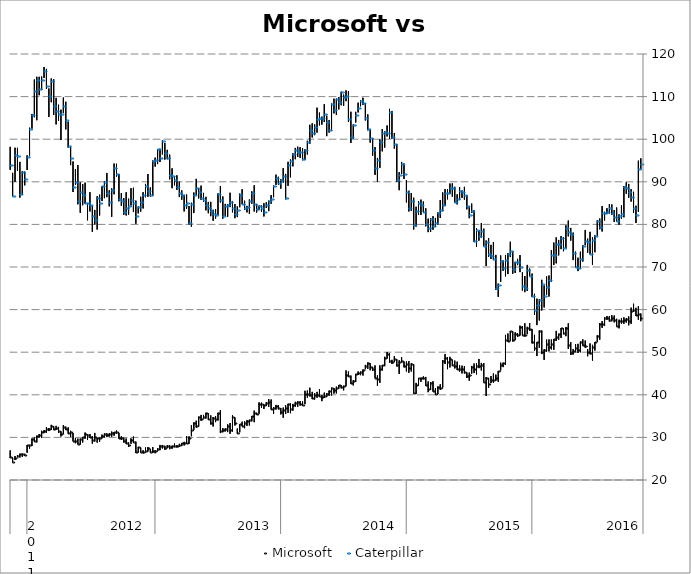
| Category | Series 0 | Series 1 | Microsoft |
|---|---|---|---|
| 0 | 59.08 | 57.28 | 58.12 |
| 1/1/00 | 60.78 | 57.63 | 59.02 |
| 1/2/00 | 60.42 | 58.52 | 58.71 |
| 1/3/00 | 61.37 | 59.58 | 59.87 |
| 1/4/00 | 60.45 | 56.66 | 59.66 |
| 1/5/00 | 58.39 | 56.32 | 57.42 |
| 1/6/00 | 57.98 | 56.97 | 57.8 |
| 1/7/00 | 58.17 | 56.68 | 57.6 |
| 1/8/00 | 58 | 56.75 | 57.43 |
| 1/9/00 | 57.63 | 55.61 | 57.25 |
| 1/10/00 | 57.84 | 56.21 | 56.21 |
| 1/11/00 | 58.6 | 57.01 | 57.67 |
| 1/12/00 | 58.7 | 57.26 | 58.03 |
| 1/13/00 | 58.5 | 57.2 | 57.62 |
| 1/14/00 | 58.5 | 57.62 | 57.94 |
| 1/15/00 | 58.21 | 56.14 | 57.96 |
| 1/16/00 | 57.29 | 55.72 | 56.68 |
| 1/17/00 | 56.84 | 52.93 | 56.57 |
| 1/18/00 | 54 | 52.47 | 53.7 |
| 1/19/00 | 52.36 | 50.39 | 52.3 |
| 1/20/00 | 51.72 | 48.04 | 51.16 |
| 1/21/00 | 52.06 | 49.52 | 49.83 |
| 1/22/00 | 50.72 | 49.06 | 50.13 |
| 1/23/00 | 52.73 | 51.04 | 51.48 |
| 1/24/00 | 53 | 51.6 | 51.79 |
| 1/25/00 | 52.49 | 49.98 | 52.32 |
| 1/26/00 | 51.96 | 49.82 | 50.62 |
| 1/27/00 | 51.9 | 50 | 51.08 |
| 1/28/00 | 50.75 | 49.46 | 50.39 |
| 1/29/00 | 52.35 | 49.35 | 49.87 |
| 1/30/00 | 56.77 | 50.77 | 51.78 |
| 1/31/00 | 55.92 | 53.76 | 55.65 |
| 2/1/00 | 55.66 | 54.21 | 54.42 |
| 2/2/00 | 55.64 | 53.33 | 55.57 |
| 2/3/00 | 54.33 | 52.93 | 54.21 |
| 2/4/00 | 55 | 52.63 | 53.49 |
| 2/5/00 | 53.07 | 50.58 | 53.07 |
| 2/6/00 | 52.97 | 50.66 | 52.03 |
| 2/7/00 | 53 | 50.2 | 51.3 |
| 2/8/00 | 52.95 | 50.13 | 51.82 |
| 2/9/00 | 50.68 | 48.19 | 50.5 |
| 2/10/00 | 55.09 | 49.56 | 50.16 |
| 2/11/00 | 55.09 | 51.02 | 55.09 |
| 2/12/00 | 52.33 | 49.1 | 52.29 |
| 2/13/00 | 54.07 | 50.34 | 50.99 |
| 2/14/00 | 55.39 | 52.07 | 52.33 |
| 2/15/00 | 56.85 | 54.98 | 55.48 |
| 2/16/00 | 55.96 | 54.23 | 55.67 |
| 2/17/00 | 56.79 | 53.68 | 54.13 |
| 2/18/00 | 56.1 | 54.01 | 54.06 |
| 2/19/00 | 56.23 | 53.93 | 55.91 |
| 2/20/00 | 54.46 | 53.58 | 53.93 |
| 2/21/00 | 54.66 | 52.85 | 54.19 |
| 2/22/00 | 54.87 | 52.53 | 52.84 |
| 2/23/00 | 54.98 | 52.62 | 54.92 |
| 2/24/00 | 54.37 | 52.5 | 52.64 |
| 2/25/00 | 54.07 | 47.02 | 52.87 |
| 2/26/00 | 47.54 | 46.5 | 47.51 |
| 2/27/00 | 47.54 | 45.7 | 47.11 |
| 2/28/00 | 45.57 | 43.05 | 45.57 |
| 2/28/00 | 44.73 | 43.27 | 43.94 |
| 3/1/00 | 45 | 42.86 | 43.48 |
| 3/2/00 | 44.4 | 42.75 | 43.48 |
| 3/3/00 | 43.98 | 41.66 | 42.61 |
| 3/4/00 | 44.15 | 39.72 | 43.93 |
| 3/5/00 | 47.45 | 43.07 | 43.07 |
| 3/6/00 | 47.49 | 45.71 | 47 |
| 3/7/00 | 48.41 | 46.26 | 46.74 |
| 3/8/00 | 47.4 | 44.79 | 46.7 |
| 3/9/00 | 47.33 | 45.1 | 45.94 |
| 3/10/00 | 46.78 | 44.95 | 46.62 |
| 3/11/00 | 45.22 | 43.32 | 44.61 |
| 3/12/00 | 45.23 | 43.94 | 44.4 |
| 3/13/00 | 46.72 | 45.03 | 45.26 |
| 3/14/00 | 46.83 | 45.02 | 46.1 |
| 3/15/00 | 46.92 | 45.46 | 45.97 |
| 3/16/00 | 47.77 | 45.84 | 46.14 |
| 3/17/00 | 48.02 | 46.19 | 46.86 |
| 3/18/00 | 48.22 | 46.82 | 46.9 |
| 3/19/00 | 48.91 | 46.42 | 48.3 |
| 3/20/00 | 48.87 | 46.02 | 47.75 |
| 3/21/00 | 49.54 | 47.22 | 48.66 |
| 3/22/00 | 48.14 | 41.68 | 47.87 |
| 3/23/00 | 42.46 | 41.16 | 41.62 |
| 3/24/00 | 41.95 | 40.18 | 41.72 |
| 3/25/00 | 41.54 | 40.12 | 40.29 |
| 3/26/00 | 43.17 | 40.83 | 40.97 |
| 3/27/00 | 42.98 | 41.15 | 42.88 |
| 3/28/00 | 43.13 | 40.61 | 41.38 |
| 3/29/00 | 44.19 | 42.15 | 42.36 |
| 3/30/00 | 44.3 | 43.65 | 43.85 |
| 3/31/00 | 44 | 43.05 | 43.86 |
| 4/1/00 | 43.87 | 42.18 | 43.87 |
| 4/2/00 | 42.79 | 40.23 | 42.41 |
| 4/3/00 | 47.13 | 40.35 | 40.4 |
| 4/4/00 | 47.39 | 45.48 | 47.18 |
| 4/5/00 | 47.91 | 45.17 | 46.24 |
| 4/6/00 | 47.82 | 45.49 | 47.19 |
| 4/7/00 | 47.78 | 46.45 | 46.76 |
| 4/8/00 | 48.8 | 47.71 | 47.88 |
| 4/9/00 | 48.1 | 44.9 | 47.66 |
| 4/10/00 | 48.35 | 46.67 | 46.95 |
| 4/11/00 | 49.06 | 47.71 | 48.42 |
| 4/12/00 | 48.2 | 47.28 | 47.81 |
| 4/13/00 | 49.71 | 47.57 | 47.98 |
| 4/14/00 | 50.05 | 48.52 | 49.58 |
| 4/15/00 | 48.92 | 46.73 | 48.68 |
| 4/16/00 | 46.97 | 45.71 | 46.95 |
| 4/17/00 | 46.9 | 42.81 | 46.13 |
| 4/18/00 | 44.56 | 42.1 | 43.63 |
| 4/19/00 | 46.89 | 43.95 | 44.03 |
| 4/20/00 | 46.56 | 45.61 | 46.09 |
| 4/21/00 | 47.38 | 45.76 | 46.41 |
| 4/22/00 | 47.57 | 46.1 | 47.52 |
| 4/23/00 | 47.02 | 45.99 | 46.7 |
| 4/24/00 | 45.93 | 44.53 | 45.91 |
| 4/25/00 | 45.44 | 44.61 | 45.43 |
| 4/26/00 | 45.47 | 44.68 | 45.15 |
| 4/27/00 | 44.9 | 43 | 44.79 |
| 4/28/00 | 43.47 | 42.21 | 43.2 |
| 4/29/00 | 44.51 | 42.6 | 42.86 |
| 4/30/00 | 45.45 | 44.22 | 44.5 |
| 5/1/00 | 45.71 | 42.03 | 44.69 |
| 5/2/00 | 42.12 | 41.05 | 42.09 |
| 5/3/00 | 42.21 | 41.53 | 41.8 |
| 5/4/00 | 42.29 | 41.43 | 42.25 |
| 5/5/00 | 41.91 | 40.34 | 41.68 |
| 5/6/00 | 41.57 | 40.29 | 41.23 |
| 5/7/00 | 41.66 | 39.86 | 41.48 |
| 5/8/00 | 40.97 | 39.81 | 40.94 |
| 5/9/00 | 40.37 | 39.46 | 40.12 |
| 5/10/00 | 40.5 | 39.27 | 39.83 |
| 5/11/00 | 39.9 | 38.51 | 39.54 |
| 5/12/00 | 41.29 | 39.66 | 39.69 |
| 5/13/00 | 40.68 | 39.3 | 39.91 |
| 5/14/00 | 40.42 | 38.9 | 40.01 |
| 5/15/00 | 40.69 | 39 | 39.21 |
| 5/16/00 | 41.66 | 39.64 | 39.87 |
| 5/17/00 | 40.99 | 39.34 | 40.3 |
| 5/18/00 | 40.94 | 37.79 | 40.16 |
| 5/19/00 | 38.45 | 37.51 | 37.7 |
| 5/20/00 | 38.48 | 37.49 | 37.9 |
| 5/21/00 | 38.46 | 37.19 | 38.31 |
| 5/22/00 | 38.35 | 37.21 | 37.98 |
| 5/23/00 | 37.86 | 36.29 | 37.62 |
| 5/24/00 | 37.99 | 35.69 | 36.56 |
| 5/25/00 | 37.89 | 35.75 | 37.84 |
| 5/26/00 | 37.55 | 35.52 | 36.81 |
| 5/27/00 | 37 | 34.63 | 36.38 |
| 5/28/00 | 36.89 | 35.4 | 36.04 |
| 5/29/00 | 37.58 | 36.6 | 36.91 |
| 5/30/00 | 37.62 | 36.55 | 37.29 |
| 5/31/00 | 37.11 | 35.53 | 36.8 |
| 6/1/00 | 38.9 | 36.62 | 36.69 |
| 6/2/00 | 38.98 | 37.18 | 38.36 |
| 6/3/00 | 38.29 | 37.35 | 38.13 |
| 6/4/00 | 37.68 | 36.67 | 37.57 |
| 6/5/00 | 38.16 | 36.9 | 37.84 |
| 6/6/00 | 38.22 | 35.55 | 37.78 |
| 6/7/00 | 35.79 | 35.26 | 35.53 |
| 6/8/00 | 36.29 | 33.57 | 35.73 |
| 6/9/00 | 34.99 | 33.78 | 34.96 |
| 6/10/00 | 34.14 | 32.8 | 34.13 |
| 6/11/00 | 34.03 | 32.7 | 33.88 |
| 6/12/00 | 33.75 | 32.15 | 33.27 |
| 6/13/00 | 33.68 | 32.69 | 32.79 |
| 6/14/00 | 33.07 | 31.2 | 33.03 |
| 6/15/00 | 32.07 | 30.95 | 31.15 |
| 6/16/00 | 34.67 | 32.8 | 33.4 |
| 6/17/00 | 35.2 | 31.37 | 34.75 |
| 6/18/00 | 33.36 | 30.84 | 31.8 |
| 6/19/00 | 33.07 | 31.25 | 32.7 |
| 6/20/00 | 32.12 | 31.4 | 31.89 |
| 6/21/00 | 32.19 | 31.21 | 31.62 |
| 6/22/00 | 36.43 | 31.02 | 31.4 |
| 6/23/00 | 35.77 | 33.98 | 35.67 |
| 6/24/00 | 34.99 | 33.58 | 34.21 |
| 6/25/00 | 34.79 | 32.57 | 34.54 |
| 6/26/00 | 35.17 | 33.05 | 33.27 |
| 6/27/00 | 35.65 | 34.25 | 34.4 |
| 6/28/00 | 35.78 | 34.43 | 35.67 |
| 6/29/00 | 35.28 | 34.41 | 34.9 |
| 6/30/00 | 35.27 | 33.9 | 34.27 |
| 7/1/00 | 34.87 | 32.55 | 34.87 |
| 7/2/00 | 33.91 | 32.32 | 32.69 |
| 7/3/00 | 33.52 | 31.77 | 33.49 |
| 7/4/00 | 32.84 | 30.27 | 31.79 |
| 7/5/00 | 30.24 | 28.5 | 29.77 |
| 7/6/00 | 30.32 | 28.47 | 28.79 |
| 7/7/00 | 28.95 | 28.11 | 28.7 |
| 7/8/00 | 28.66 | 27.96 | 28.61 |
| 7/9/00 | 28.49 | 27.81 | 28.25 |
| 7/10/00 | 28.16 | 27.64 | 28.04 |
| 7/11/00 | 28.54 | 27.7 | 28 |
| 7/12/00 | 28.05 | 27.33 | 27.95 |
| 7/13/00 | 28.2 | 27.23 | 27.76 |
| 7/14/00 | 28.16 | 27.5 | 28.01 |
| 7/15/00 | 28.02 | 27.1 | 27.55 |
| 7/16/00 | 28.23 | 27.4 | 27.93 |
| 7/17/00 | 28.23 | 27 | 27.88 |
| 7/18/00 | 27.47 | 26.76 | 27.25 |
| 7/19/00 | 26.98 | 26.28 | 26.83 |
| 7/20/00 | 27.73 | 26.37 | 26.74 |
| 7/21/00 | 27.25 | 26.55 | 26.55 |
| 7/22/00 | 27.73 | 26.68 | 27.45 |
| 7/23/00 | 27.62 | 26.52 | 26.81 |
| 7/24/00 | 26.98 | 26.26 | 26.46 |
| 7/25/00 | 27.58 | 26.49 | 26.62 |
| 7/26/00 | 27.77 | 26.46 | 27.7 |
| 7/27/00 | 29.01 | 26.34 | 26.52 |
| 7/28/00 | 30.2 | 28.8 | 28.83 |
| 7/29/00 | 29.77 | 28.5 | 29.5 |
| 7/30/00 | 28.83 | 27.76 | 28.21 |
| 7/31/00 | 29.74 | 28.5 | 28.64 |
| 8/1/00 | 29.92 | 28.8 | 29.2 |
| 8/2/00 | 30.25 | 29.42 | 29.85 |
| 8/3/00 | 31.07 | 29.74 | 29.76 |
| 8/4/00 | 31.61 | 30.91 | 31.19 |
| 8/5/00 | 31.25 | 30.4 | 31.21 |
| 8/6/00 | 31.36 | 30.15 | 30.95 |
| 8/7/00 | 30.96 | 30.22 | 30.82 |
| 8/8/00 | 30.96 | 30.08 | 30.56 |
| 8/9/00 | 30.94 | 30.01 | 30.9 |
| 8/10/00 | 30.65 | 29.81 | 30.42 |
| 8/11/00 | 29.94 | 28.97 | 29.75 |
| 8/12/00 | 29.85 | 28.78 | 29.76 |
| 8/13/00 | 31.05 | 29.04 | 30.12 |
| 8/14/00 | 30.23 | 28.54 | 29.39 |
| 8/15/00 | 30.78 | 29.95 | 30.19 |
| 8/16/00 | 30.69 | 29.42 | 30.59 |
| 8/17/00 | 31.14 | 29.71 | 30.7 |
| 8/18/00 | 30.08 | 28.82 | 30.02 |
| 8/19/00 | 29.7 | 28.32 | 29.65 |
| 8/20/00 | 29.72 | 28.44 | 28.45 |
| 8/21/00 | 29.88 | 28.64 | 29.06 |
| 8/22/00 | 31.04 | 29.17 | 29.27 |
| 8/23/00 | 31.54 | 30.1 | 31.16 |
| 8/24/00 | 32.34 | 30.92 | 30.98 |
| 8/25/00 | 32.52 | 31.83 | 31.98 |
| 8/26/00 | 32.89 | 30.77 | 32.42 |
| 8/27/00 | 31.4 | 30.23 | 30.81 |
| 8/28/00 | 32.46 | 31.05 | 31.52 |
| 8/29/00 | 32.7 | 31.81 | 32.26 |
| 8/30/00 | 32.61 | 31.72 | 32.01 |
| 8/31/00 | 32.95 | 31.82 | 32.6 |
| 9/1/00 | 32.21 | 31.49 | 31.99 |
| 9/2/00 | 32.44 | 31.1 | 32.08 |
| 9/3/00 | 31.68 | 31 | 31.48 |
| 9/4/00 | 31.55 | 29.85 | 31.25 |
| 9/5/00 | 30.8 | 29.97 | 30.5 |
| 9/6/00 | 30.4 | 28.83 | 30.24 |
| 9/7/00 | 29.95 | 29.07 | 29.23 |
| 9/8/00 | 29.74 | 27.97 | 29.71 |
| 9/9/00 | 28.25 | 27.37 | 28.25 |
| 9/10/00 | 28.19 | 26.39 | 28.11 |
| 9/11/00 | 26.15 | 25.76 | 25.96 |
| 9/12/00 | 26.19 | 25.44 | 26.03 |
| 9/13/00 | 26.17 | 25.29 | 26 |
| 9/14/00 | 25.87 | 25.34 | 25.7 |
| 9/15/00 | 25.63 | 24.69 | 25.22 |
| 9/16/00 | 25.25 | 24.3 | 24.3 |
| 9/17/00 | 26.94 | 25.15 | 25.3 |